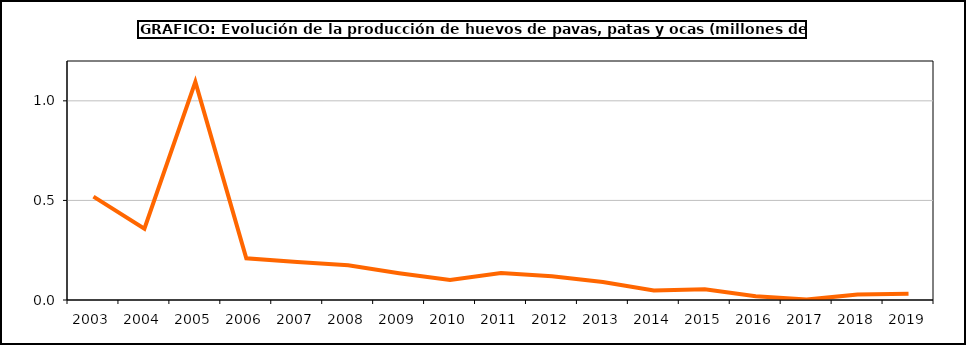
| Category | huevos |
|---|---|
| 2003.0 | 0.519 |
| 2004.0 | 0.358 |
| 2005.0 | 1.095 |
| 2006.0 | 0.209 |
| 2007.0 | 0.191 |
| 2008.0 | 0.174 |
| 2009.0 | 0.135 |
| 2010.0 | 0.1 |
| 2011.0 | 0.135 |
| 2012.0 | 0.119 |
| 2013.0 | 0.09 |
| 2014.0 | 0.047 |
| 2015.0 | 0.054 |
| 2016.0 | 0.019 |
| 2017.0 | 0.002 |
| 2018.0 | 0.027 |
| 2019.0 | 0.031 |